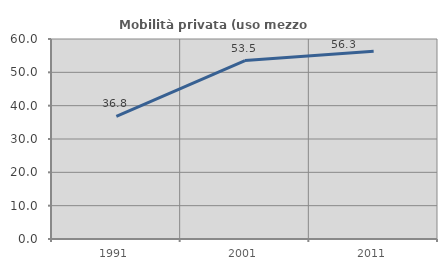
| Category | Mobilità privata (uso mezzo privato) |
|---|---|
| 1991.0 | 36.806 |
| 2001.0 | 53.543 |
| 2011.0 | 56.311 |